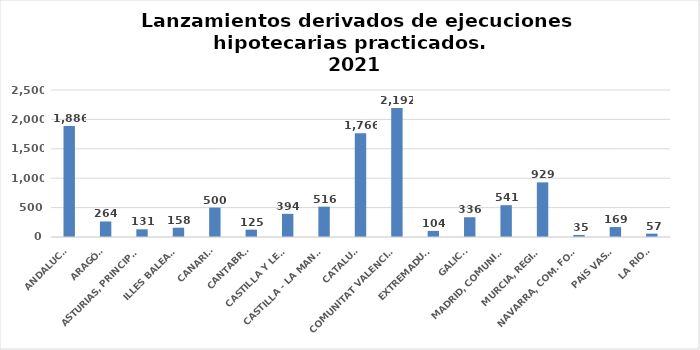
| Category | Series 0 |
|---|---|
| ANDALUCÍA | 1886 |
| ARAGÓN | 264 |
| ASTURIAS, PRINCIPADO | 131 |
| ILLES BALEARS | 158 |
| CANARIAS | 500 |
| CANTABRIA | 125 |
| CASTILLA Y LEÓN | 394 |
| CASTILLA - LA MANCHA | 516 |
| CATALUÑA | 1766 |
| COMUNITAT VALENCIANA | 2192 |
| EXTREMADURA | 104 |
| GALICIA | 336 |
| MADRID, COMUNIDAD | 541 |
| MURCIA, REGIÓN | 929 |
| NAVARRA, COM. FORAL | 35 |
| PAÍS VASCO | 169 |
| LA RIOJA | 57 |